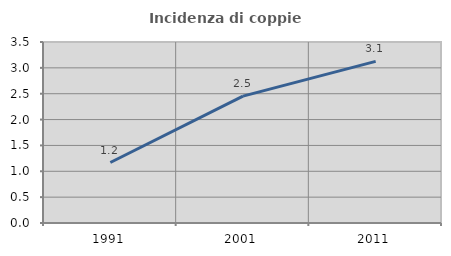
| Category | Incidenza di coppie miste |
|---|---|
| 1991.0 | 1.17 |
| 2001.0 | 2.454 |
| 2011.0 | 3.125 |